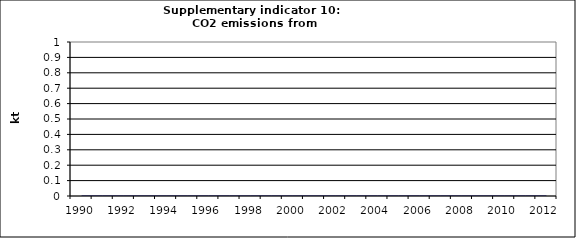
| Category | CO2 emissions from autoproducers, kt |
|---|---|
| 1990 | 0 |
| 1991 | 0 |
| 1992 | 0 |
| 1993 | 0 |
| 1994 | 0 |
| 1995 | 0 |
| 1996 | 0 |
| 1997 | 0 |
| 1998 | 0 |
| 1999 | 0 |
| 2000 | 0 |
| 2001 | 0 |
| 2002 | 0 |
| 2003 | 0 |
| 2004 | 0 |
| 2005 | 0 |
| 2006 | 0 |
| 2007 | 0 |
| 2008 | 0 |
| 2009 | 0 |
| 2010 | 0 |
| 2011 | 0 |
| 2012 | 0 |